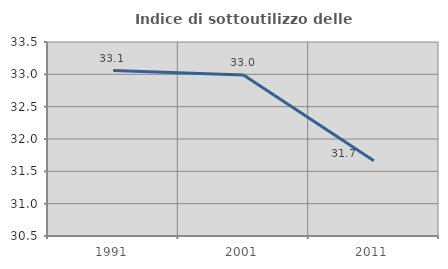
| Category | Indice di sottoutilizzo delle abitazioni  |
|---|---|
| 1991.0 | 33.058 |
| 2001.0 | 32.99 |
| 2011.0 | 31.663 |